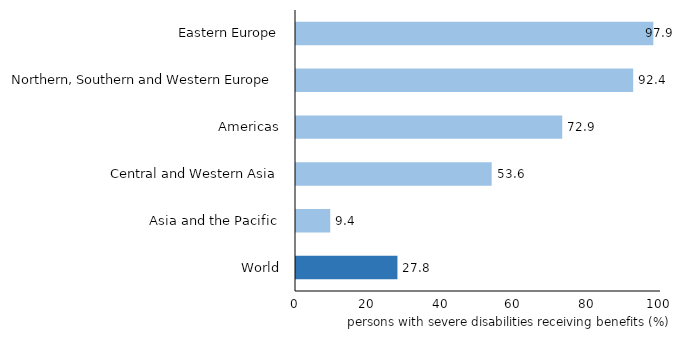
| Category | Series 0 |
|---|---|
| World | 27.79 |
| Asia and the Pacific | 9.381 |
| Central and Western Asia | 53.609 |
| Americas | 72.938 |
| Northern, Southern and Western Europe | 92.381 |
| Eastern Europe | 97.906 |